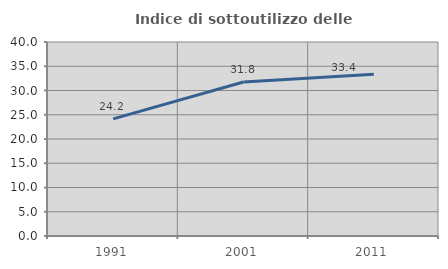
| Category | Indice di sottoutilizzo delle abitazioni  |
|---|---|
| 1991.0 | 24.16 |
| 2001.0 | 31.763 |
| 2011.0 | 33.376 |